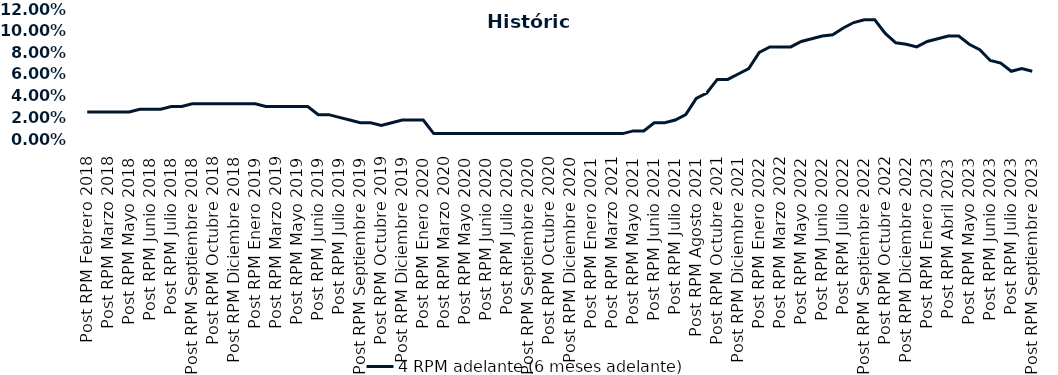
| Category | 4 RPM adelante (6 meses adelante) |
|---|---|
| Post RPM Febrero 2018 | 0.025 |
| Pre RPM Marzo 2018 | 0.025 |
| Post RPM Marzo 2018 | 0.025 |
| Pre RPM Mayo 2018 | 0.025 |
| Post RPM Mayo 2018 | 0.025 |
| Pre RPM Junio 2018 | 0.028 |
| Post RPM Junio 2018 | 0.028 |
| Pre RPM Julio 2018 | 0.028 |
| Post RPM Julio 2018 | 0.03 |
| Pre RPM Septiembre 2018 | 0.03 |
| Post RPM Septiembre 2018 | 0.032 |
| Pre RPM Octubre 2018 | 0.032 |
| Post RPM Octubre 2018 | 0.032 |
| Pre RPM Diciembre 2018 | 0.032 |
| Post RPM Diciembre 2018 | 0.032 |
| Pre RPM Enero 2019 | 0.032 |
| Post RPM Enero 2019 | 0.032 |
| Pre RPM Marzo 2019 | 0.03 |
| Post RPM Marzo 2019 | 0.03 |
| Pre RPM Mayo 2019 | 0.03 |
| Post RPM Mayo 2019 | 0.03 |
| Pre RPM Junio 2019 | 0.03 |
| Post RPM Junio 2019 | 0.022 |
| Pre RPM Julio 2019 | 0.022 |
| Post RPM Julio 2019 | 0.02 |
| Pre RPM Septiembre 2019 | 0.018 |
| Post RPM Septiembre 2019 | 0.015 |
| Pre RPM Octubre 2019 | 0.015 |
| Post RPM Octubre 2019 | 0.012 |
| Pre RPM Diciembre 2019 | 0.015 |
| Post RPM Diciembre 2019 | 0.018 |
| Pre RPM Enero 2020 | 0.018 |
| Post RPM Enero 2020 | 0.018 |
| Pre RPM Marzo 2020 | 0.005 |
| Post RPM Marzo 2020 | 0.005 |
| Pre RPM Mayo 2020 | 0.005 |
| Post RPM Mayo 2020 | 0.005 |
| Pre RPM Junio 2020 | 0.005 |
| Post RPM Junio 2020 | 0.005 |
| Pre RPM Julio 2020 | 0.005 |
| Post RPM Julio 2020 | 0.005 |
| Pre RPM Septiembre 2020 | 0.005 |
| Post RPM Septiembre 2020 | 0.005 |
| Pre RPM Octubre 2020 | 0.005 |
| Post RPM Octubre 2020 | 0.005 |
| Pre RPM Diciembre 2020 | 0.005 |
| Post RPM Diciembre 2020 | 0.005 |
| Pre RPM Enero 2021 | 0.005 |
| Post RPM Enero 2021 | 0.005 |
| Pre RPM Marzo 2021 | 0.005 |
| Post RPM Marzo 2021 | 0.005 |
| Pre RPM Mayo 2021 | 0.005 |
| Post RPM Mayo 2021 | 0.008 |
| Pre RPM Junio 2021 | 0.008 |
| Post RPM Junio 2021 | 0.015 |
| Pre RPM Julio 2021 | 0.015 |
| Post RPM Julio 2021 | 0.018 |
| Pre RPM Agosto 2021 | 0.022 |
| Post RPM Agosto 2021 | 0.038 |
| Pre RPM Octubre 2021 | 0.042 |
| Post RPM Octubre 2021 | 0.055 |
| Pre RPM Diciembre 2021 | 0.055 |
| Post RPM Diciembre 2021 | 0.06 |
| Pre RPM Enero 2022 | 0.065 |
| Post RPM Enero 2022 | 0.08 |
| Pre RPM Marzo 2022 | 0.085 |
| Post RPM Marzo 2022 | 0.085 |
| Pre RPM Mayo 2022 | 0.085 |
| Post RPM Mayo 2022 | 0.09 |
| Pre RPM Junio 2022 | 0.092 |
| Post RPM Junio 2022 | 0.095 |
| Pre RPM Julio 2022 | 0.096 |
| Post RPM Julio 2022 | 0.102 |
| Pre RPM Septiembre 2022 | 0.108 |
| Post RPM Septiembre 2022 | 0.11 |
| Pre RPM Octubre 2022 | 0.11 |
| Post RPM Octubre 2022 | 0.098 |
| Pre RPM Diciembre 2022 | 0.089 |
| Post RPM Diciembre 2022 | 0.088 |
| Pre RPM Enero 2023 | 0.085 |
| Post RPM Enero 2023 | 0.09 |
| Pre RPM Abril 2023 | 0.092 |
| Post RPM Abril 2023 | 0.095 |
| Pre RPM Mayo 2023 | 0.095 |
| Post RPM Mayo 2023 | 0.088 |
| Pre RPM Junio 2023 | 0.082 |
| Post RPM Junio 2023 | 0.072 |
| Pre RPM Julio 2023 | 0.07 |
| Post RPM Julio 2023 | 0.062 |
| Pre RPM Septiembre 2023 | 0.065 |
| Post RPM Septiembre 2023 | 0.062 |